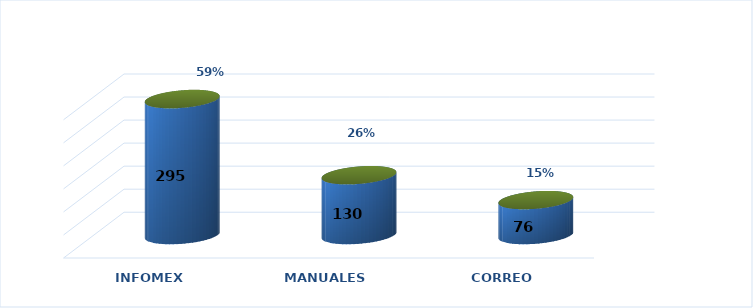
| Category | Series 0 | Series 1 |
|---|---|---|
| INFOMEX | 295 | 0.589 |
| MANUALES | 130 | 0.259 |
| CORREO | 76 | 0.152 |